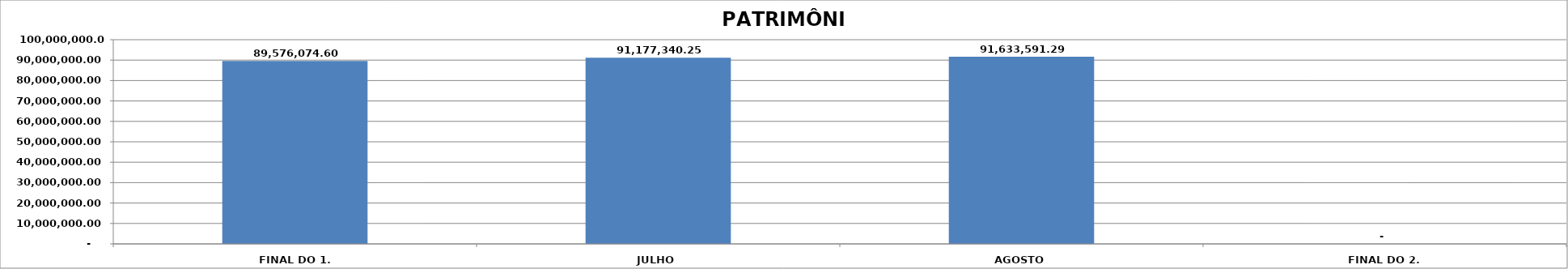
| Category | SALDO |
|---|---|
| FINAL DO 1. TRIMESTRE | 89576074.6 |
| JULHO | 91177340.25 |
| AGOSTO | 91633591.29 |
| FINAL DO 2. TRIMESTRE | 0 |